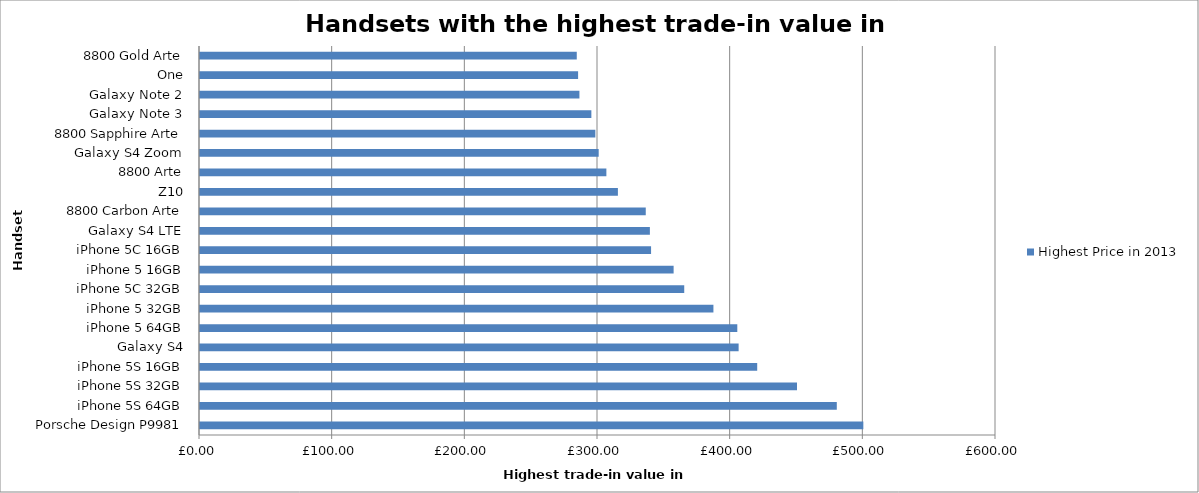
| Category | Highest Price in 2013 |
|---|---|
| Porsche Design P9981 | 500 |
| iPhone 5S 64GB | 480 |
| iPhone 5S 32GB | 450 |
| iPhone 5S 16GB | 420 |
| Galaxy S4 | 406 |
| iPhone 5 64GB | 405 |
| iPhone 5 32GB | 387 |
| iPhone 5C 32GB | 365 |
| iPhone 5 16GB | 357 |
| iPhone 5C 16GB | 340 |
| Galaxy S4 LTE | 339.11 |
| 8800 Carbon Arte | 336 |
| Z10 | 315 |
| 8800 Arte | 306.31 |
| Galaxy S4 Zoom | 300.52 |
| 8800 Sapphire Arte | 298 |
| Galaxy Note 3 | 295 |
| Galaxy Note 2 | 286 |
| One | 285 |
| 8800 Gold Arte | 284 |